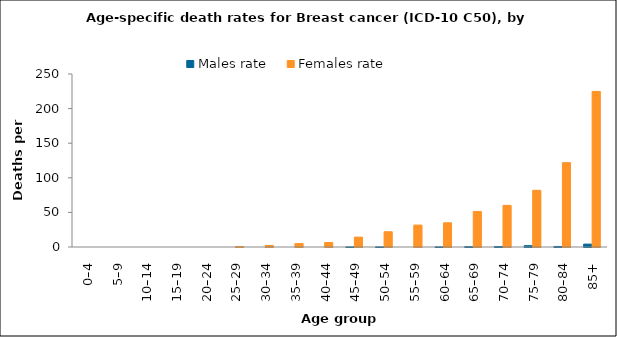
| Category | Males rate | Females rate |
|---|---|---|
| 0–4 | 0 | 0 |
| 5–9 | 0 | 0 |
| 10–14 | 0 | 0 |
| 15–19 | 0 | 0 |
| 20–24 | 0 | 0 |
| 25–29 | 0 | 0.554 |
| 30–34 | 0 | 2.273 |
| 35–39 | 0 | 4.926 |
| 40–44 | 0 | 6.489 |
| 45–49 | 0.125 | 14.279 |
| 50–54 | 0.123 | 22.03 |
| 55–59 | 0 | 31.655 |
| 60–64 | 0.138 | 34.946 |
| 65–69 | 0.478 | 51.36 |
| 70–74 | 0.726 | 60.127 |
| 75–79 | 1.911 | 81.907 |
| 80–84 | 0.768 | 121.892 |
| 85+ | 4.17 | 224.832 |